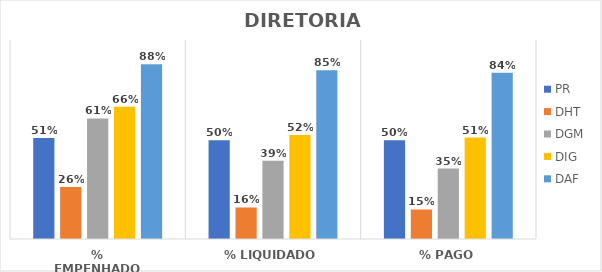
| Category | PR | DHT | DGM | DIG | DAF |
|---|---|---|---|---|---|
| % EMPENHADO | 0.508 | 0.261 | 0.606 | 0.664 | 0.879 |
| % LIQUIDADO | 0.497 | 0.158 | 0.393 | 0.523 | 0.848 |
| % PAGO | 0.497 | 0.148 | 0.354 | 0.51 | 0.835 |